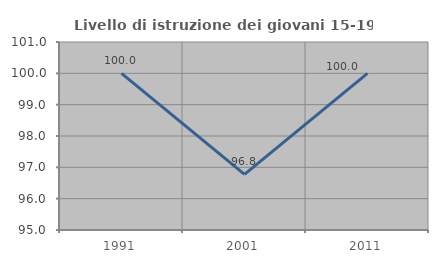
| Category | Livello di istruzione dei giovani 15-19 anni |
|---|---|
| 1991.0 | 100 |
| 2001.0 | 96.774 |
| 2011.0 | 100 |